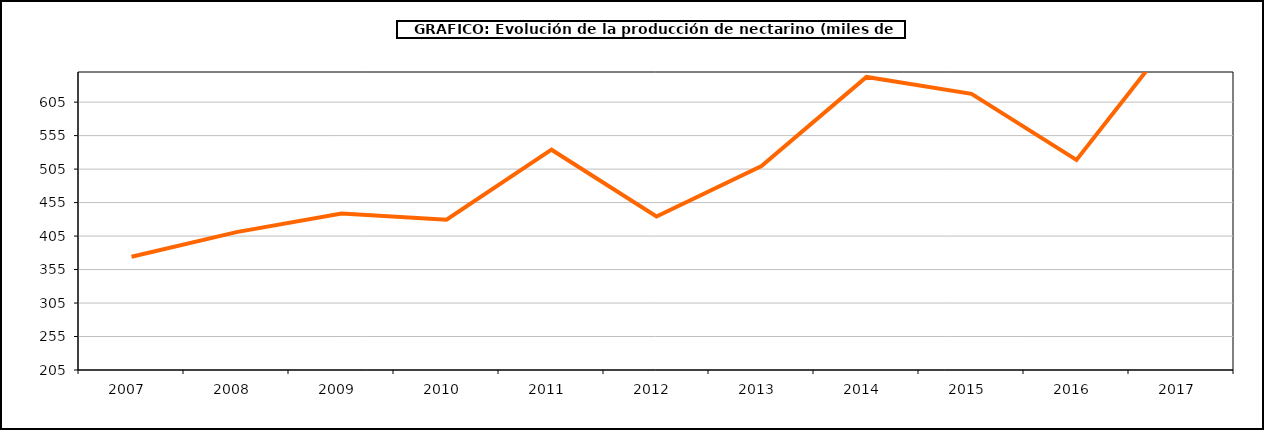
| Category | producción melocotonero |
|---|---|
| 2007.0 | 374.22 |
| 2008.0 | 410.882 |
| 2009.0 | 438.741 |
| 2010.0 | 429.51 |
| 2011.0 | 533.971 |
| 2012.0 | 434.327 |
| 2013.0 | 509.713 |
| 2014.0 | 642.573 |
| 2015.0 | 617.396 |
| 2016.0 | 518.794 |
| 2017.0 | 718.528 |